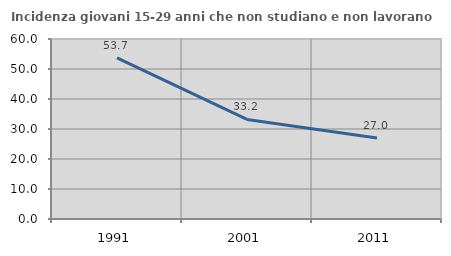
| Category | Incidenza giovani 15-29 anni che non studiano e non lavorano  |
|---|---|
| 1991.0 | 53.701 |
| 2001.0 | 33.199 |
| 2011.0 | 27.036 |